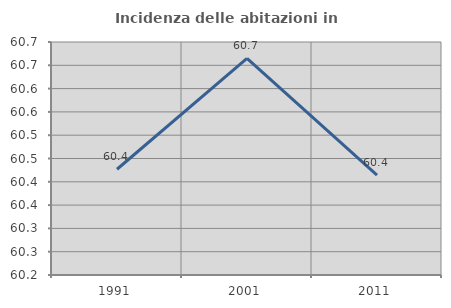
| Category | Incidenza delle abitazioni in proprietà  |
|---|---|
| 1991.0 | 60.427 |
| 2001.0 | 60.665 |
| 2011.0 | 60.414 |